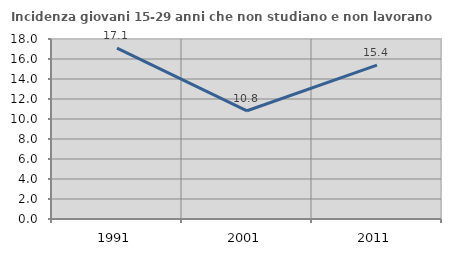
| Category | Incidenza giovani 15-29 anni che non studiano e non lavorano  |
|---|---|
| 1991.0 | 17.087 |
| 2001.0 | 10.823 |
| 2011.0 | 15.389 |